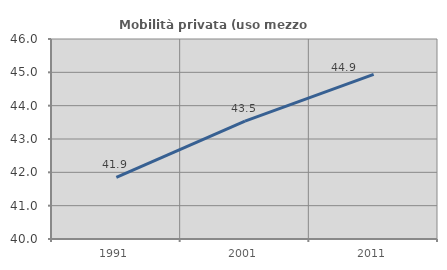
| Category | Mobilità privata (uso mezzo privato) |
|---|---|
| 1991.0 | 41.85 |
| 2001.0 | 43.537 |
| 2011.0 | 44.94 |